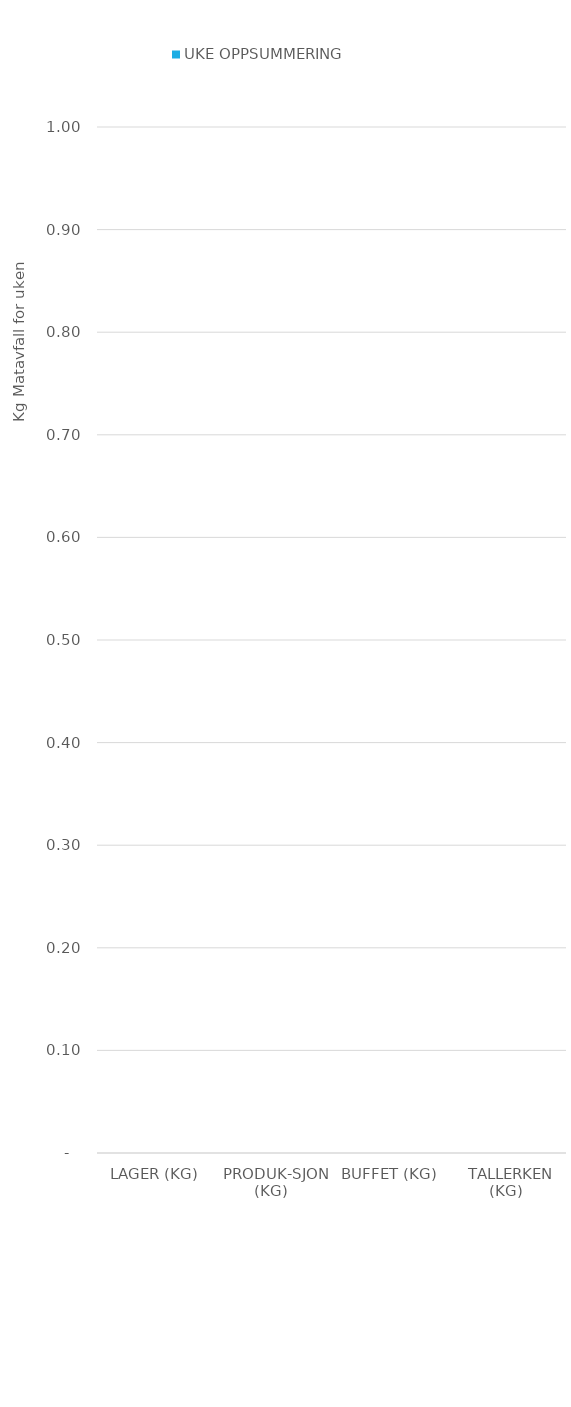
| Category | UKE OPPSUMMERING |
|---|---|
|  LAGER (KG)  | 0 |
|  PRODUK-SJON (KG)  | 0 |
|  BUFFET (KG)  | 0 |
|  TALLERKEN (KG)  | 0 |